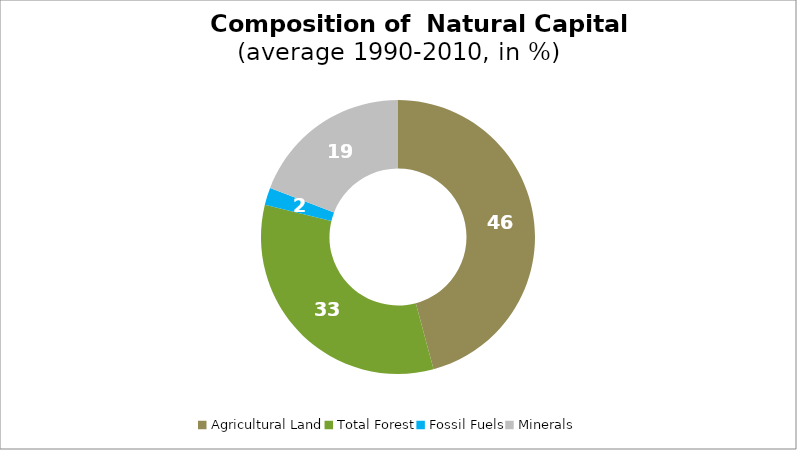
| Category | Series 0 |
|---|---|
| Agricultural Land | 45.819 |
| Total Forest | 32.957 |
| Fossil Fuels | 2.06 |
| Minerals | 19.165 |